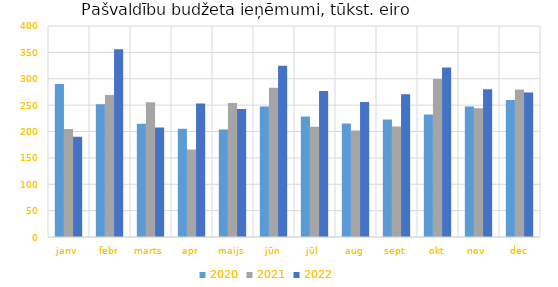
| Category | 2020 | 2021 | 2022 |
|---|---|---|---|
| janv | 290064.145 | 204517.329 | 190252.346 |
| febr | 251741.549 | 269110.565 | 356152.105 |
| marts | 214628.306 | 255479.297 | 207474.213 |
| apr | 205049 | 166036.194 | 253268.686 |
| maijs | 203771.42 | 253889.01 | 242842.454 |
| jūn | 247277.58 | 283015.617 | 324518.39 |
| jūl | 228229.354 | 209024.05 | 276611.728 |
| aug | 215329.064 | 201829.938 | 255749.732 |
| sept | 222973.772 | 209634.733 | 270436.895 |
| okt | 232443.755 | 299380.785 | 321133.295 |
| nov | 247188.407 | 244254.482 | 280117.67 |
| dec | 259624.166 | 279855.963 | 273764.648 |